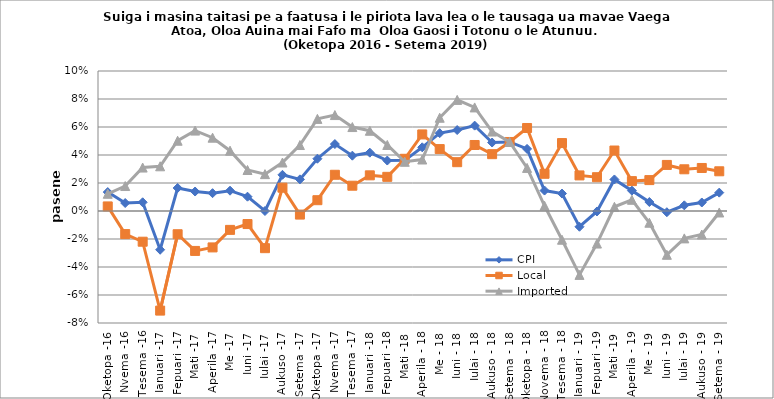
| Category | CPI | Local | Imported |
|---|---|---|---|
| Oketopa -16 | 0.014 | 0.003 | 0.012 |
| Nvema -16 | 0.006 | -0.016 | 0.018 |
| Tesema -16 | 0.006 | -0.022 | 0.031 |
| Ianuari -17 | -0.028 | -0.071 | 0.032 |
| Fepuari -17 | 0.016 | -0.017 | 0.05 |
| Mati -17 | 0.014 | -0.029 | 0.057 |
| Aperila -17 | 0.013 | -0.026 | 0.052 |
| Me -17 | 0.015 | -0.013 | 0.043 |
| Iuni -17 | 0.01 | -0.009 | 0.029 |
| Iulai -17 | 0 | -0.027 | 0.026 |
| Aukuso -17 | 0.026 | 0.017 | 0.035 |
| Setema -17 | 0.023 | -0.003 | 0.047 |
| Oketopa -17 | 0.037 | 0.008 | 0.066 |
| Nvema -17 | 0.048 | 0.026 | 0.069 |
| Tesema -17 | 0.04 | 0.018 | 0.06 |
| Ianuari -18 | 0.042 | 0.025 | 0.057 |
| Fepuari -18 | 0.036 | 0.024 | 0.047 |
| Mati -18 | 0.036 | 0.037 | 0.035 |
| Aperila - 18 | 0.045 | 0.055 | 0.037 |
| Me - 18 | 0.056 | 0.044 | 0.067 |
| Iuni - 18 | 0.058 | 0.035 | 0.079 |
| Iulai - 18 | 0.061 | 0.047 | 0.074 |
| Aukuso - 18 | 0.049 | 0.041 | 0.057 |
| Setema - 18 | 0.049 | 0.049 | 0.049 |
| Oketopa - 18 | 0.044 | 0.059 | 0.031 |
| Novema - 18 | 0.015 | 0.027 | 0.004 |
| Tesema - 18 | 0.012 | 0.049 | -0.021 |
| Ianuari - 19 | -0.011 | 0.025 | -0.046 |
| Fepuari -19 | 0 | 0.024 | -0.023 |
| Mati -19 | 0.023 | 0.043 | 0.003 |
| Aperila - 19 | 0.015 | 0.021 | 0.008 |
| Me - 19 | 0.006 | 0.022 | -0.008 |
| Iuni - 19 | -0.001 | 0.033 | -0.031 |
| Iulai - 19 | 0.004 | 0.03 | -0.02 |
| Aukuso - 19 | 0.006 | 0.031 | -0.017 |
| Setema - 19 | 0.013 | 0.028 | -0.001 |